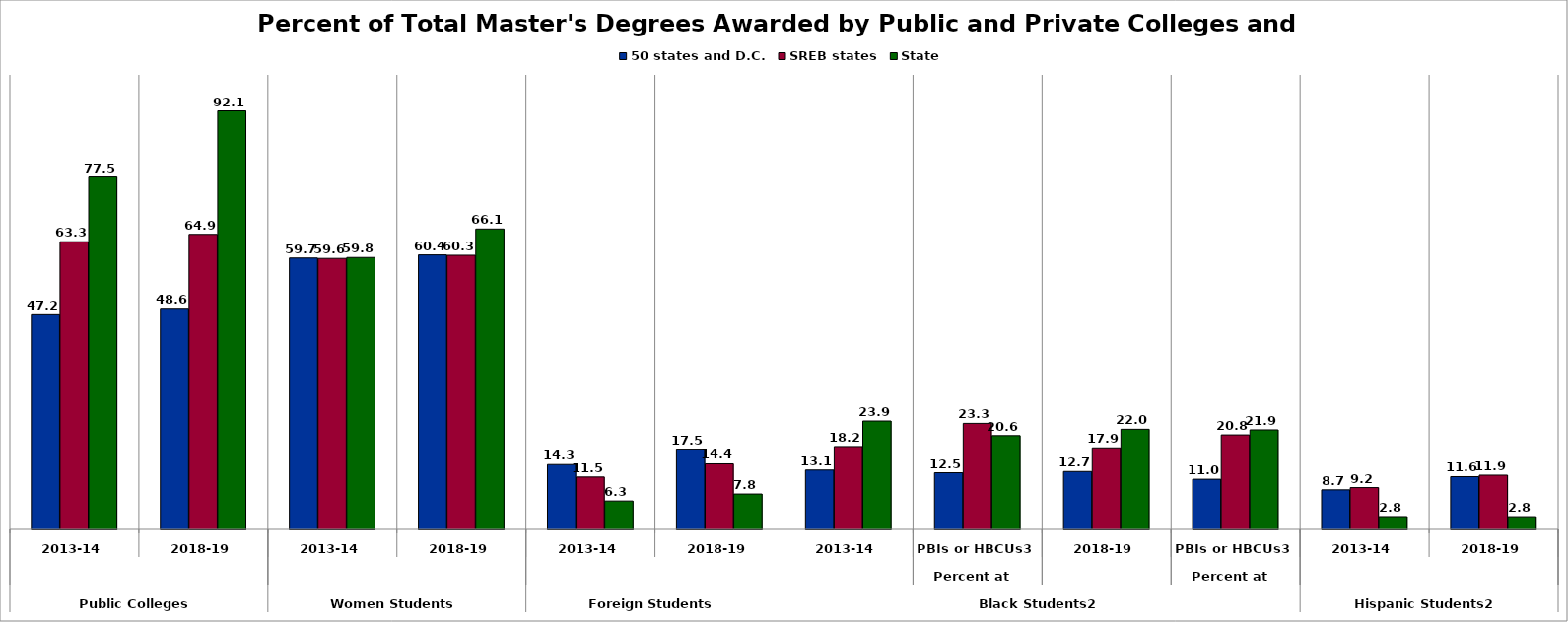
| Category | 50 states and D.C. | SREB states | State |
|---|---|---|---|
| 0 | 47.211 | 63.286 | 77.534 |
| 1 | 48.646 | 64.908 | 92.082 |
| 2 | 59.705 | 59.611 | 59.818 |
| 3 | 60.388 | 60.31 | 66.095 |
| 4 | 14.269 | 11.528 | 6.258 |
| 5 | 17.482 | 14.427 | 7.794 |
| 6 | 13.064 | 18.237 | 23.856 |
| 7 | 12.468 | 23.341 | 20.642 |
| 8 | 12.738 | 17.944 | 22.045 |
| 9 | 11.041 | 20.807 | 21.913 |
| 10 | 8.709 | 9.202 | 2.825 |
| 11 | 11.606 | 11.936 | 2.804 |